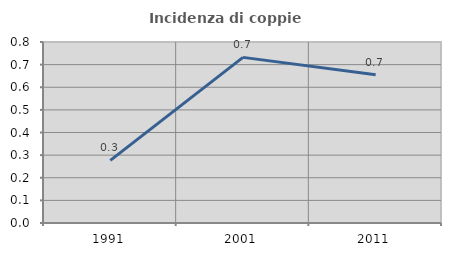
| Category | Incidenza di coppie miste |
|---|---|
| 1991.0 | 0.277 |
| 2001.0 | 0.732 |
| 2011.0 | 0.655 |